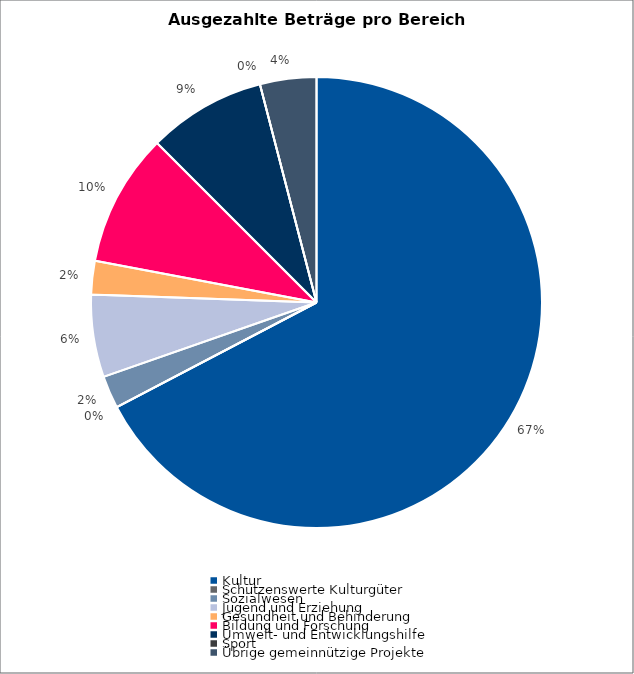
| Category | Series 0 |
|---|---|
| Kultur | 3689715 |
| Schützenswerte Kulturgüter | 0 |
| Sozialwesen | 128100 |
| Jugend und Erziehung | 324100 |
| Gesundheit und Behinderung | 131500 |
| Bildung und Forschung | 522500 |
| Umwelt- und Entwicklungshilfe | 464000 |
| Sport | 0 |
| Übrige gemeinnützige Projekte | 221500 |